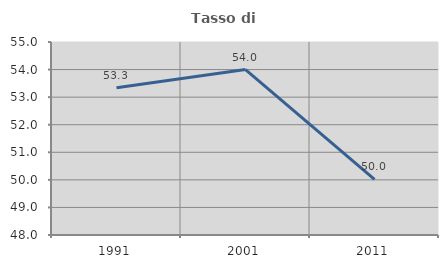
| Category | Tasso di occupazione   |
|---|---|
| 1991.0 | 53.342 |
| 2001.0 | 54.001 |
| 2011.0 | 50.021 |